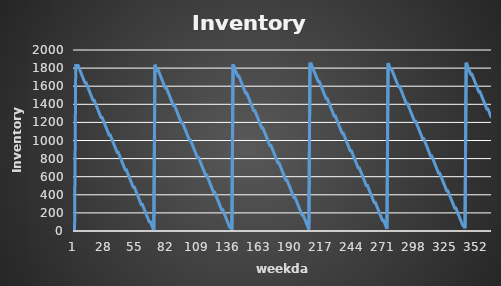
| Category | Series 0 |
|---|---|
| 0 | 0 |
| 1 | 1829.899 |
| 2 | 1829.899 |
| 3 | 1829.899 |
| 4 | 1797.899 |
| 5 | 1765.899 |
| 6 | 1733.899 |
| 7 | 1701.899 |
| 8 | 1669.899 |
| 9 | 1637.899 |
| 10 | 1637.899 |
| 11 | 1605.899 |
| 12 | 1573.899 |
| 13 | 1541.899 |
| 14 | 1509.899 |
| 15 | 1477.899 |
| 16 | 1445.899 |
| 17 | 1445.899 |
| 18 | 1413.899 |
| 19 | 1381.899 |
| 20 | 1349.899 |
| 21 | 1317.899 |
| 22 | 1285.899 |
| 23 | 1253.899 |
| 24 | 1253.899 |
| 25 | 1221.899 |
| 26 | 1189.899 |
| 27 | 1157.899 |
| 28 | 1125.899 |
| 29 | 1093.899 |
| 30 | 1061.899 |
| 31 | 1061.899 |
| 32 | 1029.899 |
| 33 | 997.899 |
| 34 | 965.899 |
| 35 | 933.899 |
| 36 | 901.899 |
| 37 | 869.899 |
| 38 | 869.899 |
| 39 | 837.899 |
| 40 | 805.899 |
| 41 | 773.899 |
| 42 | 741.899 |
| 43 | 709.899 |
| 44 | 677.899 |
| 45 | 677.899 |
| 46 | 645.899 |
| 47 | 613.899 |
| 48 | 581.899 |
| 49 | 549.899 |
| 50 | 517.899 |
| 51 | 485.899 |
| 52 | 485.899 |
| 53 | 453.899 |
| 54 | 421.899 |
| 55 | 389.899 |
| 56 | 357.899 |
| 57 | 325.899 |
| 58 | 293.899 |
| 59 | 293.899 |
| 60 | 261.899 |
| 61 | 229.899 |
| 62 | 197.899 |
| 63 | 165.899 |
| 64 | 133.899 |
| 65 | 101.899 |
| 66 | 101.899 |
| 67 | 69.899 |
| 68 | 37.899 |
| 69 | 5.899 |
| 70 | 1835.797 |
| 71 | 1803.797 |
| 72 | 1771.797 |
| 73 | 1771.797 |
| 74 | 1739.797 |
| 75 | 1707.797 |
| 76 | 1675.797 |
| 77 | 1643.797 |
| 78 | 1611.797 |
| 79 | 1579.797 |
| 80 | 1579.797 |
| 81 | 1547.797 |
| 82 | 1515.797 |
| 83 | 1483.797 |
| 84 | 1451.797 |
| 85 | 1419.797 |
| 86 | 1387.797 |
| 87 | 1387.797 |
| 88 | 1355.797 |
| 89 | 1323.797 |
| 90 | 1291.797 |
| 91 | 1259.797 |
| 92 | 1227.797 |
| 93 | 1195.797 |
| 94 | 1195.797 |
| 95 | 1163.797 |
| 96 | 1131.797 |
| 97 | 1099.797 |
| 98 | 1067.797 |
| 99 | 1035.797 |
| 100 | 1003.797 |
| 101 | 1003.797 |
| 102 | 971.797 |
| 103 | 939.797 |
| 104 | 907.797 |
| 105 | 875.797 |
| 106 | 843.797 |
| 107 | 811.797 |
| 108 | 811.797 |
| 109 | 779.797 |
| 110 | 747.797 |
| 111 | 715.797 |
| 112 | 683.797 |
| 113 | 651.797 |
| 114 | 619.797 |
| 115 | 619.797 |
| 116 | 587.797 |
| 117 | 555.797 |
| 118 | 523.797 |
| 119 | 491.797 |
| 120 | 459.797 |
| 121 | 427.797 |
| 122 | 427.797 |
| 123 | 395.797 |
| 124 | 363.797 |
| 125 | 331.797 |
| 126 | 299.797 |
| 127 | 267.797 |
| 128 | 235.797 |
| 129 | 235.797 |
| 130 | 203.797 |
| 131 | 171.797 |
| 132 | 139.797 |
| 133 | 107.797 |
| 134 | 75.797 |
| 135 | 43.797 |
| 136 | 43.797 |
| 137 | 11.797 |
| 138 | 1841.696 |
| 139 | 1809.696 |
| 140 | 1777.696 |
| 141 | 1745.696 |
| 142 | 1713.696 |
| 143 | 1713.696 |
| 144 | 1681.696 |
| 145 | 1649.696 |
| 146 | 1617.696 |
| 147 | 1585.696 |
| 148 | 1553.696 |
| 149 | 1521.696 |
| 150 | 1521.696 |
| 151 | 1489.696 |
| 152 | 1457.696 |
| 153 | 1425.696 |
| 154 | 1393.696 |
| 155 | 1361.696 |
| 156 | 1329.696 |
| 157 | 1329.696 |
| 158 | 1297.696 |
| 159 | 1265.696 |
| 160 | 1233.696 |
| 161 | 1201.696 |
| 162 | 1169.696 |
| 163 | 1137.696 |
| 164 | 1137.696 |
| 165 | 1105.696 |
| 166 | 1073.696 |
| 167 | 1041.696 |
| 168 | 1009.696 |
| 169 | 977.696 |
| 170 | 945.696 |
| 171 | 945.696 |
| 172 | 913.696 |
| 173 | 881.696 |
| 174 | 849.696 |
| 175 | 817.696 |
| 176 | 785.696 |
| 177 | 753.696 |
| 178 | 753.696 |
| 179 | 721.696 |
| 180 | 689.696 |
| 181 | 657.696 |
| 182 | 625.696 |
| 183 | 593.696 |
| 184 | 561.696 |
| 185 | 561.696 |
| 186 | 529.696 |
| 187 | 497.696 |
| 188 | 465.696 |
| 189 | 433.696 |
| 190 | 401.696 |
| 191 | 369.696 |
| 192 | 369.696 |
| 193 | 337.696 |
| 194 | 305.696 |
| 195 | 273.696 |
| 196 | 241.696 |
| 197 | 209.696 |
| 198 | 177.696 |
| 199 | 177.696 |
| 200 | 145.696 |
| 201 | 113.696 |
| 202 | 81.696 |
| 203 | 49.696 |
| 204 | 17.696 |
| 205 | 1847.595 |
| 206 | 1847.595 |
| 207 | 1815.595 |
| 208 | 1783.595 |
| 209 | 1751.595 |
| 210 | 1719.595 |
| 211 | 1687.595 |
| 212 | 1655.595 |
| 213 | 1655.595 |
| 214 | 1623.595 |
| 215 | 1591.595 |
| 216 | 1559.595 |
| 217 | 1527.595 |
| 218 | 1495.595 |
| 219 | 1463.595 |
| 220 | 1463.595 |
| 221 | 1431.595 |
| 222 | 1399.595 |
| 223 | 1367.595 |
| 224 | 1335.595 |
| 225 | 1303.595 |
| 226 | 1271.595 |
| 227 | 1271.595 |
| 228 | 1239.595 |
| 229 | 1207.595 |
| 230 | 1175.595 |
| 231 | 1143.595 |
| 232 | 1111.595 |
| 233 | 1079.595 |
| 234 | 1079.595 |
| 235 | 1047.595 |
| 236 | 1015.595 |
| 237 | 983.595 |
| 238 | 951.595 |
| 239 | 919.595 |
| 240 | 887.595 |
| 241 | 887.595 |
| 242 | 855.595 |
| 243 | 823.595 |
| 244 | 791.595 |
| 245 | 759.595 |
| 246 | 727.595 |
| 247 | 695.595 |
| 248 | 695.595 |
| 249 | 663.595 |
| 250 | 631.595 |
| 251 | 599.595 |
| 252 | 567.595 |
| 253 | 535.595 |
| 254 | 503.595 |
| 255 | 503.595 |
| 256 | 471.595 |
| 257 | 439.595 |
| 258 | 407.595 |
| 259 | 375.595 |
| 260 | 343.595 |
| 261 | 311.595 |
| 262 | 311.595 |
| 263 | 279.595 |
| 264 | 247.595 |
| 265 | 215.595 |
| 266 | 183.595 |
| 267 | 151.595 |
| 268 | 119.595 |
| 269 | 119.595 |
| 270 | 87.595 |
| 271 | 55.595 |
| 272 | 23.595 |
| 273 | 1853.493 |
| 274 | 1821.493 |
| 275 | 1789.493 |
| 276 | 1789.493 |
| 277 | 1757.493 |
| 278 | 1725.493 |
| 279 | 1693.493 |
| 280 | 1661.493 |
| 281 | 1629.493 |
| 282 | 1597.493 |
| 283 | 1597.493 |
| 284 | 1565.493 |
| 285 | 1533.493 |
| 286 | 1501.493 |
| 287 | 1469.493 |
| 288 | 1437.493 |
| 289 | 1405.493 |
| 290 | 1405.493 |
| 291 | 1373.493 |
| 292 | 1341.493 |
| 293 | 1309.493 |
| 294 | 1277.493 |
| 295 | 1245.493 |
| 296 | 1213.493 |
| 297 | 1213.493 |
| 298 | 1181.493 |
| 299 | 1149.493 |
| 300 | 1117.493 |
| 301 | 1085.493 |
| 302 | 1053.493 |
| 303 | 1021.493 |
| 304 | 1021.493 |
| 305 | 989.493 |
| 306 | 957.493 |
| 307 | 925.493 |
| 308 | 893.493 |
| 309 | 861.493 |
| 310 | 829.493 |
| 311 | 829.493 |
| 312 | 797.493 |
| 313 | 765.493 |
| 314 | 733.493 |
| 315 | 701.493 |
| 316 | 669.493 |
| 317 | 637.493 |
| 318 | 637.493 |
| 319 | 605.493 |
| 320 | 573.493 |
| 321 | 541.493 |
| 322 | 509.493 |
| 323 | 477.493 |
| 324 | 445.493 |
| 325 | 445.493 |
| 326 | 413.493 |
| 327 | 381.493 |
| 328 | 349.493 |
| 329 | 317.493 |
| 330 | 285.493 |
| 331 | 253.493 |
| 332 | 253.493 |
| 333 | 221.493 |
| 334 | 189.493 |
| 335 | 157.493 |
| 336 | 125.493 |
| 337 | 93.493 |
| 338 | 61.493 |
| 339 | 61.493 |
| 340 | 29.493 |
| 341 | 1859.392 |
| 342 | 1827.392 |
| 343 | 1795.392 |
| 344 | 1763.392 |
| 345 | 1731.392 |
| 346 | 1731.392 |
| 347 | 1699.392 |
| 348 | 1667.392 |
| 349 | 1635.392 |
| 350 | 1603.392 |
| 351 | 1571.392 |
| 352 | 1539.392 |
| 353 | 1539.392 |
| 354 | 1507.392 |
| 355 | 1475.392 |
| 356 | 1443.392 |
| 357 | 1411.392 |
| 358 | 1379.392 |
| 359 | 1347.392 |
| 360 | 1347.392 |
| 361 | 1315.392 |
| 362 | 1283.392 |
| 363 | 1251.392 |